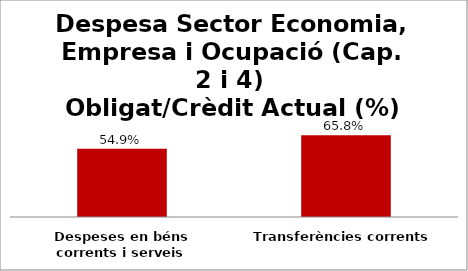
| Category | Series 0 |
|---|---|
| Despeses en béns corrents i serveis | 0.549 |
| Transferències corrents | 0.658 |